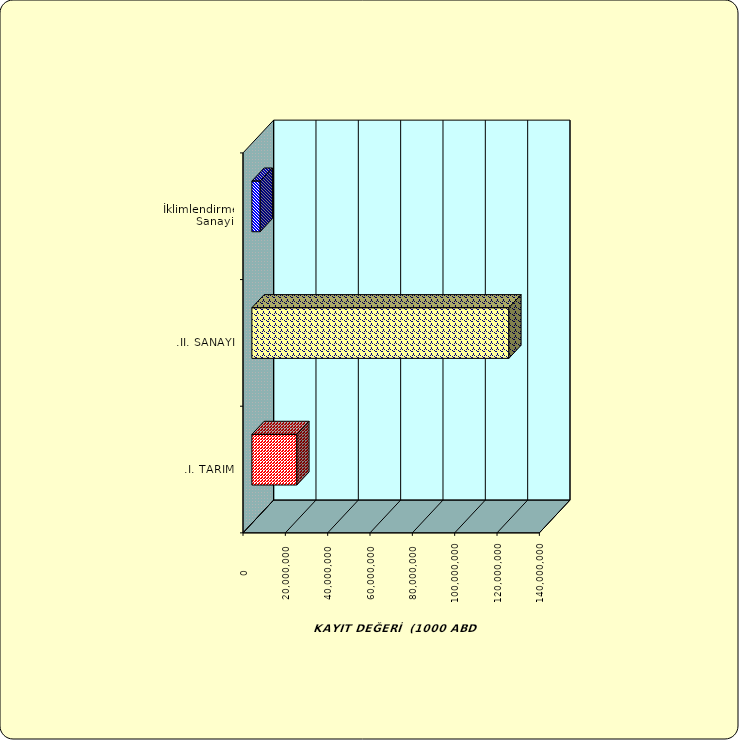
| Category | Series 0 |
|---|---|
| .I. TARIM | 21235089.413 |
| .II. SANAYİ | 121392772.692 |
|  İklimlendirme Sanayii | 3921347.704 |